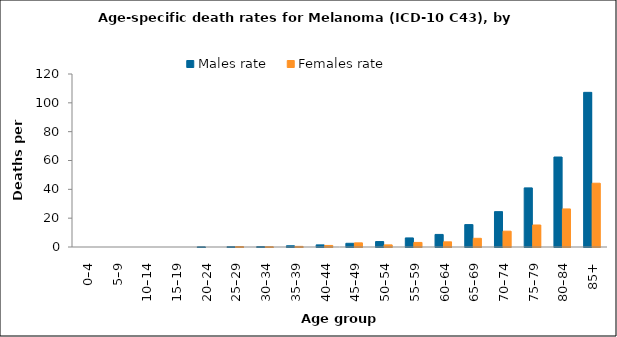
| Category | Males rate | Females rate |
|---|---|---|
| 0–4 | 0 | 0 |
| 5–9 | 0 | 0 |
| 10–14 | 0 | 0 |
| 15–19 | 0 | 0 |
| 20–24 | 0.119 | 0 |
| 25–29 | 0.218 | 0.332 |
| 30–34 | 0.319 | 0.209 |
| 35–39 | 0.862 | 0.426 |
| 40–44 | 1.471 | 1.073 |
| 45–49 | 2.569 | 2.882 |
| 50–54 | 3.778 | 1.468 |
| 55–59 | 6.295 | 3.173 |
| 60–64 | 8.718 | 3.582 |
| 65–69 | 15.546 | 6.037 |
| 70–74 | 24.518 | 10.978 |
| 75–79 | 40.996 | 15.262 |
| 80–84 | 62.409 | 26.401 |
| 85+ | 107.271 | 44.247 |